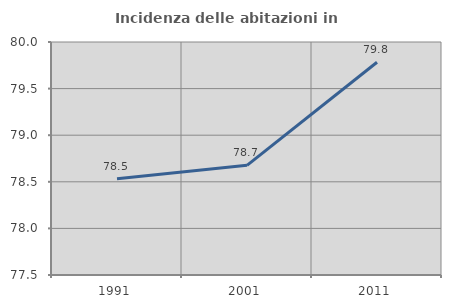
| Category | Incidenza delle abitazioni in proprietà  |
|---|---|
| 1991.0 | 78.533 |
| 2001.0 | 78.676 |
| 2011.0 | 79.783 |